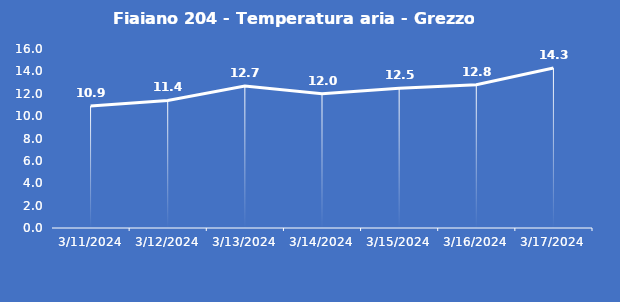
| Category | Fiaiano 204 - Temperatura aria - Grezzo (°C) |
|---|---|
| 3/11/24 | 10.9 |
| 3/12/24 | 11.4 |
| 3/13/24 | 12.7 |
| 3/14/24 | 12 |
| 3/15/24 | 12.5 |
| 3/16/24 | 12.8 |
| 3/17/24 | 14.3 |